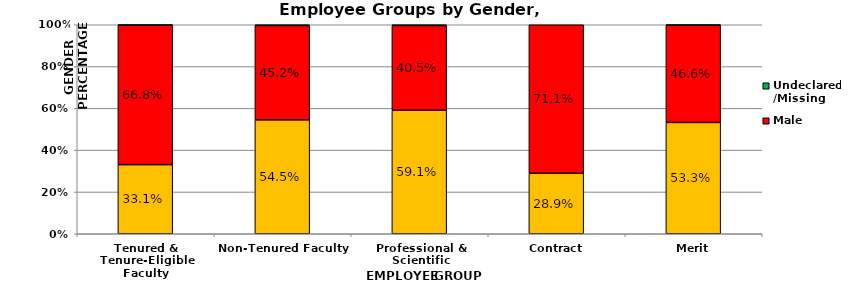
| Category | Female | Male | Undeclared/Missing |
|---|---|---|---|
| Tenured & Tenure-Eligible Faculty | 0.331 | 0.668 | 0.002 |
| Non-Tenured Faculty | 0.545 | 0.452 | 0.003 |
| Professional & Scientific | 0.591 | 0.405 | 0.004 |
| Contract | 0.289 | 0.711 | 0 |
| Merit | 0.533 | 0.466 | 0.002 |